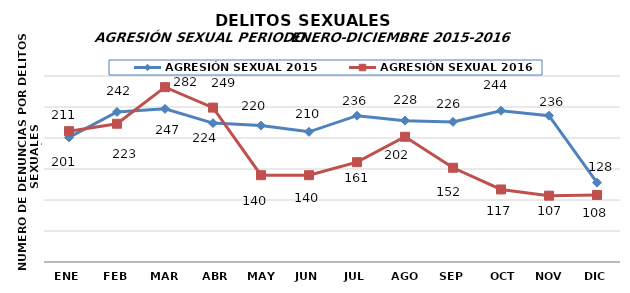
| Category | AGRESIÓN SEXUAL 2015 | AGRESIÓN SEXUAL 2016 |
|---|---|---|
| ENE | 201 | 211 |
| FEB | 242 | 223 |
| MAR | 247 | 282 |
| ABR | 224 | 249 |
| MAY | 220 | 140 |
| JUN | 210 | 140 |
| JUL | 236 | 161 |
| AGO | 228 | 202 |
| SEP | 226 | 152 |
| OCT | 244 | 117 |
| NOV | 236 | 107 |
| DIC | 128 | 108 |